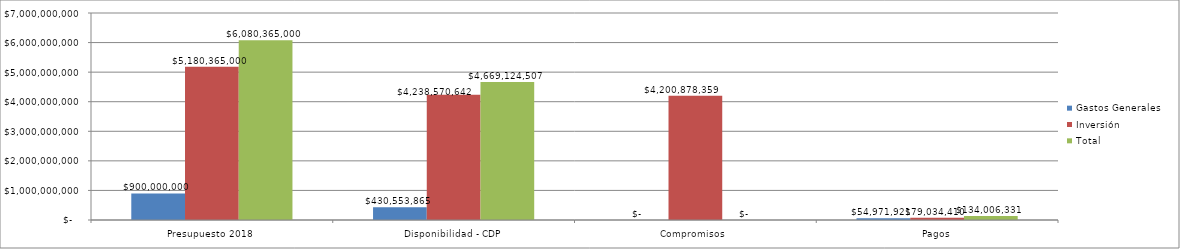
| Category | Gastos Generales  | Inversión | Total |
|---|---|---|---|
| Presupuesto 2018 | 900000000 | 5180365000 | 6080365000 |
| Disponibilidad - CDP | 430553865 | 4238570642 | 4669124507 |
| Compromisos  | 0 | 4200878359 | 0 |
| Pagos | 54971921 | 79034410 | 134006331 |